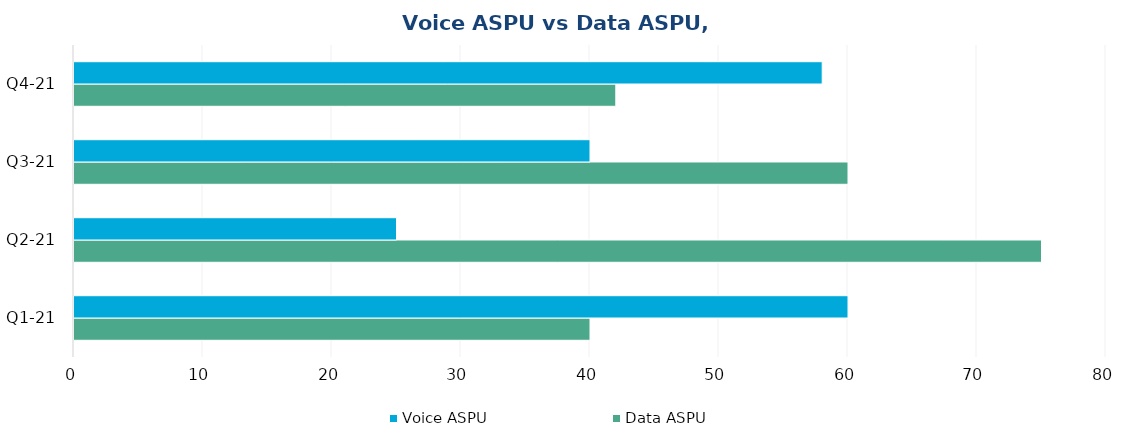
| Category | Data ASPU | Voice ASPU |
|---|---|---|
| Q1-21 | 40 | 60 |
| Q2-21 | 75 | 25 |
| Q3-21 | 60 | 40 |
| Q4-21 | 42 | 58 |